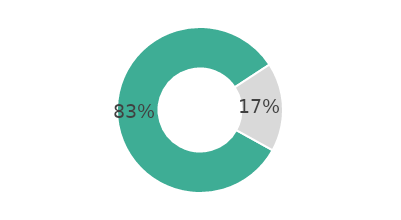
| Category | Series 0 |
|---|---|
| 0 | 82.73 |
| 1 | 17.27 |